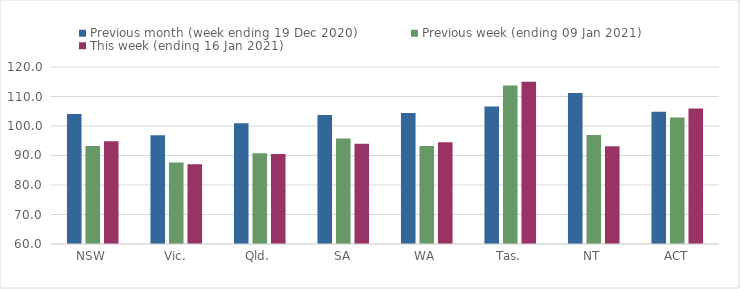
| Category | Previous month (week ending 19 Dec 2020) | Previous week (ending 09 Jan 2021) | This week (ending 16 Jan 2021) |
|---|---|---|---|
| NSW | 104.04 | 93.21 | 94.87 |
| Vic. | 96.83 | 87.66 | 87.04 |
| Qld. | 100.97 | 90.76 | 90.47 |
| SA | 103.72 | 95.73 | 93.95 |
| WA | 104.4 | 93.25 | 94.46 |
| Tas. | 106.57 | 113.69 | 114.97 |
| NT | 111.2 | 96.95 | 93.13 |
| ACT | 104.81 | 102.88 | 105.92 |